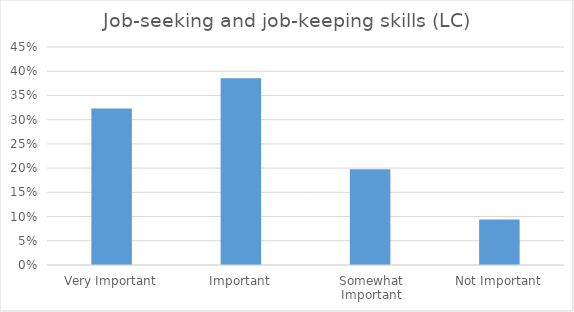
| Category | Job-seeking and job-keeping skills (LC) |
|---|---|
| Very Important | 0.323 |
| Important | 0.385 |
| Somewhat Important | 0.198 |
| Not Important | 0.094 |